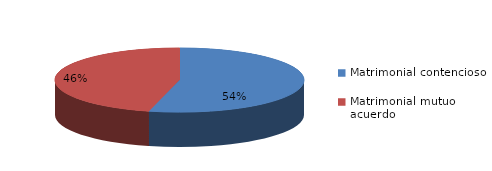
| Category | Series 0 |
|---|---|
| 0 | 308 |
| 1 | 263 |